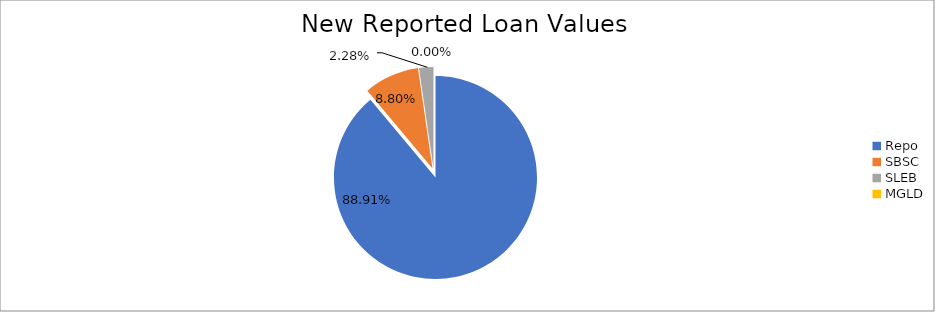
| Category | Series 0 |
|---|---|
| Repo | 6520492.166 |
| SBSC | 645363.433 |
| SLEB | 167303.01 |
| MGLD | 260.508 |